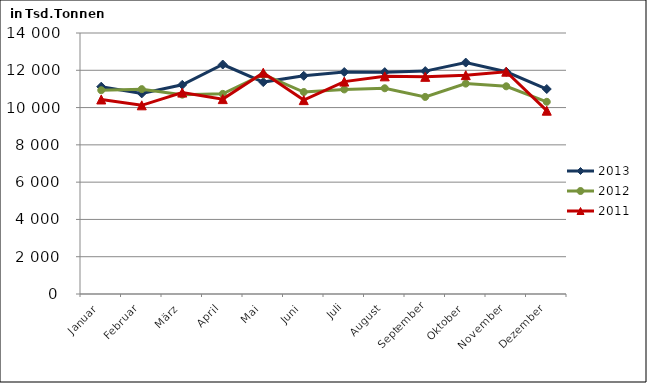
| Category | 2013 | 2012 | 2011 |
|---|---|---|---|
| Januar | 11119.399 | 10930.193 | 10435.128 |
| Februar | 10760.95 | 10988.258 | 10120.422 |
| März | 11221.318 | 10692.464 | 10803.585 |
| April | 12309.798 | 10735.21 | 10453.089 |
| Mai | 11367.286 | 11773.32 | 11869.931 |
| Juni | 11702.924 | 10833.616 | 10400.024 |
| Juli | 11905.804 | 10973.372 | 11392.74 |
| August | 11900.761 | 11035.258 | 11674.22 |
| September | 11955.163 | 10571.178 | 11648.803 |
| Oktober | 12414.086 | 11285.846 | 11738.468 |
| November | 11920.704 | 11140.971 | 11924.476 |
| Dezember | 10995.382 | 10309.711 | 9832.309 |